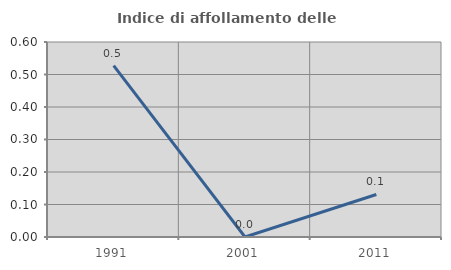
| Category | Indice di affollamento delle abitazioni  |
|---|---|
| 1991.0 | 0.527 |
| 2001.0 | 0 |
| 2011.0 | 0.131 |